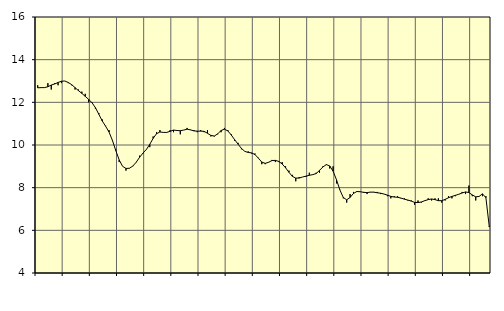
| Category | Piggar | Tillverkning av verkstadsvaror, SNI 25-30, 33 |
|---|---|---|
| nan | 12.8 | 12.68 |
| 87.0 | 12.7 | 12.69 |
| 87.0 | 12.7 | 12.69 |
| 87.0 | 12.9 | 12.73 |
| nan | 12.6 | 12.81 |
| 88.0 | 12.9 | 12.86 |
| 88.0 | 12.8 | 12.93 |
| 88.0 | 12.9 | 12.99 |
| nan | 13 | 13 |
| 89.0 | 12.9 | 12.93 |
| 89.0 | 12.8 | 12.83 |
| 89.0 | 12.6 | 12.69 |
| nan | 12.6 | 12.55 |
| 90.0 | 12.5 | 12.42 |
| 90.0 | 12.4 | 12.28 |
| 90.0 | 12 | 12.14 |
| nan | 12 | 11.98 |
| 91.0 | 11.7 | 11.75 |
| 91.0 | 11.5 | 11.44 |
| 91.0 | 11.2 | 11.13 |
| nan | 10.9 | 10.88 |
| 92.0 | 10.7 | 10.61 |
| 92.0 | 10.2 | 10.22 |
| 92.0 | 9.8 | 9.74 |
| nan | 9.2 | 9.3 |
| 93.0 | 9 | 9 |
| 93.0 | 8.8 | 8.9 |
| 93.0 | 8.9 | 8.91 |
| nan | 9 | 9.01 |
| 94.0 | 9.2 | 9.19 |
| 94.0 | 9.5 | 9.42 |
| 94.0 | 9.6 | 9.62 |
| nan | 9.8 | 9.79 |
| 95.0 | 9.9 | 10.03 |
| 95.0 | 10.4 | 10.31 |
| 95.0 | 10.6 | 10.53 |
| nan | 10.7 | 10.61 |
| 96.0 | 10.6 | 10.59 |
| 96.0 | 10.6 | 10.59 |
| 96.0 | 10.7 | 10.64 |
| nan | 10.6 | 10.7 |
| 97.0 | 10.7 | 10.68 |
| 97.0 | 10.5 | 10.67 |
| 97.0 | 10.7 | 10.7 |
| nan | 10.8 | 10.74 |
| 98.0 | 10.7 | 10.71 |
| 98.0 | 10.7 | 10.66 |
| 98.0 | 10.6 | 10.65 |
| nan | 10.7 | 10.65 |
| 99.0 | 10.6 | 10.64 |
| 99.0 | 10.7 | 10.55 |
| 99.0 | 10.4 | 10.45 |
| nan | 10.4 | 10.42 |
| 0.0 | 10.5 | 10.52 |
| 0.0 | 10.6 | 10.68 |
| 0.0 | 10.8 | 10.74 |
| nan | 10.7 | 10.66 |
| 1.0 | 10.5 | 10.47 |
| 1.0 | 10.2 | 10.25 |
| 1.0 | 10.1 | 10.04 |
| nan | 9.8 | 9.84 |
| 2.0 | 9.7 | 9.7 |
| 2.0 | 9.7 | 9.65 |
| 2.0 | 9.6 | 9.63 |
| nan | 9.6 | 9.55 |
| 3.0 | 9.4 | 9.38 |
| 3.0 | 9.1 | 9.2 |
| 3.0 | 9.1 | 9.14 |
| nan | 9.2 | 9.19 |
| 4.0 | 9.3 | 9.27 |
| 4.0 | 9.2 | 9.28 |
| 4.0 | 9.2 | 9.23 |
| nan | 9.2 | 9.11 |
| 5.0 | 9 | 8.93 |
| 5.0 | 8.8 | 8.72 |
| 5.0 | 8.6 | 8.53 |
| nan | 8.3 | 8.45 |
| 6.0 | 8.5 | 8.45 |
| 6.0 | 8.5 | 8.5 |
| 6.0 | 8.5 | 8.54 |
| nan | 8.7 | 8.58 |
| 7.0 | 8.6 | 8.61 |
| 7.0 | 8.7 | 8.66 |
| 7.0 | 8.7 | 8.81 |
| nan | 9 | 8.97 |
| 8.0 | 9.1 | 9.08 |
| 8.0 | 8.9 | 9.02 |
| 8.0 | 9 | 8.77 |
| nan | 8.2 | 8.37 |
| 9.0 | 7.9 | 7.89 |
| 9.0 | 7.5 | 7.54 |
| 9.0 | 7.3 | 7.43 |
| nan | 7.7 | 7.54 |
| 10.0 | 7.8 | 7.73 |
| 10.0 | 7.8 | 7.82 |
| 10.0 | 7.8 | 7.81 |
| nan | 7.8 | 7.78 |
| 11.0 | 7.7 | 7.77 |
| 11.0 | 7.8 | 7.79 |
| 11.0 | 7.8 | 7.79 |
| nan | 7.8 | 7.76 |
| 12.0 | 7.7 | 7.74 |
| 12.0 | 7.7 | 7.7 |
| 12.0 | 7.6 | 7.65 |
| nan | 7.5 | 7.59 |
| 13.0 | 7.6 | 7.56 |
| 13.0 | 7.6 | 7.55 |
| 13.0 | 7.5 | 7.51 |
| nan | 7.5 | 7.46 |
| 14.0 | 7.4 | 7.42 |
| 14.0 | 7.4 | 7.37 |
| 14.0 | 7.2 | 7.31 |
| nan | 7.4 | 7.3 |
| 15.0 | 7.3 | 7.33 |
| 15.0 | 7.4 | 7.39 |
| 15.0 | 7.5 | 7.44 |
| nan | 7.4 | 7.47 |
| 16.0 | 7.5 | 7.44 |
| 16.0 | 7.5 | 7.39 |
| 16.0 | 7.3 | 7.39 |
| nan | 7.4 | 7.45 |
| 17.0 | 7.6 | 7.53 |
| 17.0 | 7.5 | 7.59 |
| 17.0 | 7.6 | 7.64 |
| nan | 7.7 | 7.69 |
| 18.0 | 7.8 | 7.75 |
| 18.0 | 7.7 | 7.8 |
| 18.0 | 8.1 | 7.77 |
| nan | 7.6 | 7.66 |
| 19.0 | 7.4 | 7.57 |
| 19.0 | 7.6 | 7.59 |
| 19.0 | 7.6 | 7.71 |
| nan | 7.6 | 7.53 |
| 20.0 | 6.2 | 6.16 |